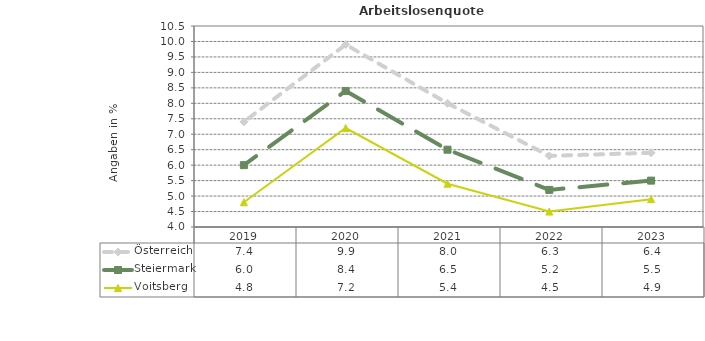
| Category | Österreich | Steiermark | Voitsberg |
|---|---|---|---|
| 2023.0 | 6.4 | 5.5 | 4.9 |
| 2022.0 | 6.3 | 5.2 | 4.5 |
| 2021.0 | 8 | 6.5 | 5.4 |
| 2020.0 | 9.9 | 8.4 | 7.2 |
| 2019.0 | 7.4 | 6 | 4.8 |